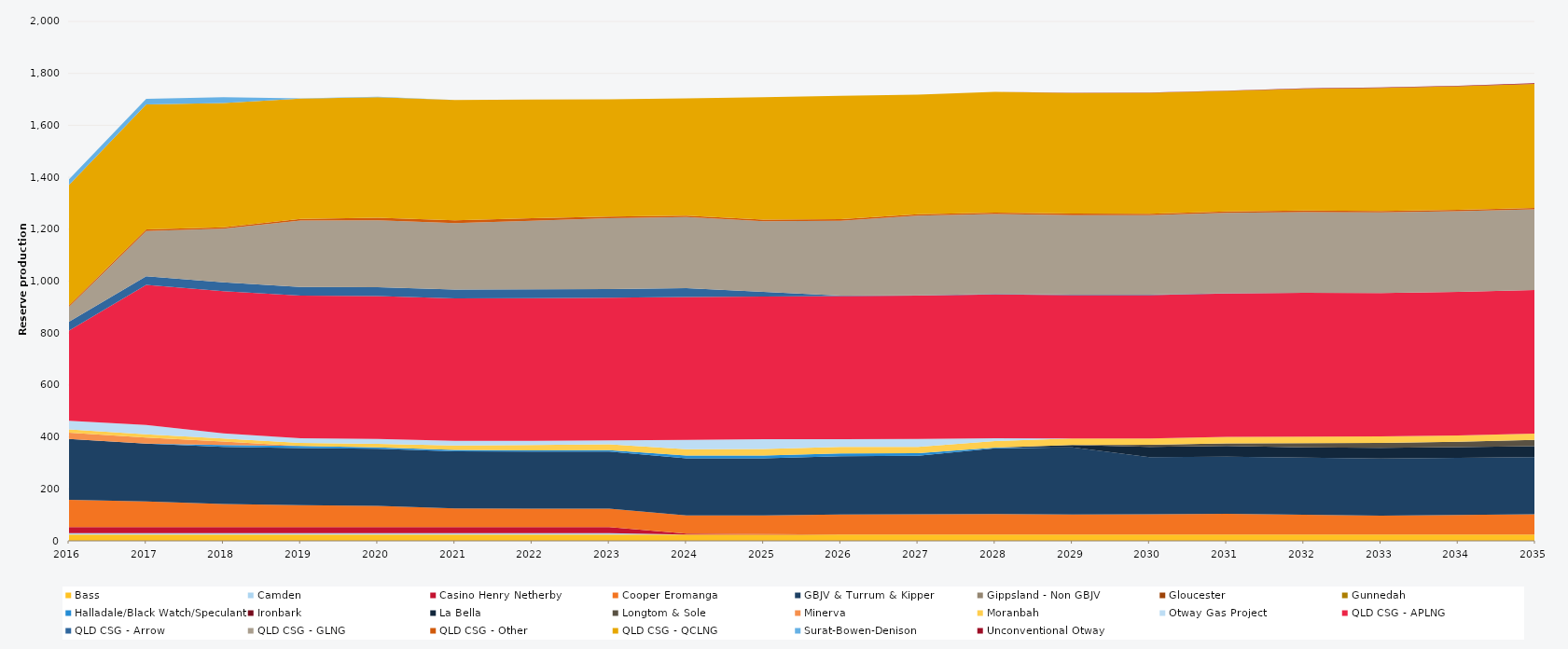
| Category | Bass | Camden | Casino Henry Netherby | Cooper Eromanga | GBJV & Turrum & Kipper | Gippsland - Non GBJV | Gloucester | Gunnedah | Halladale/Black Watch/Speculant | Ironbark | La Bella | Longtom & Sole | Minerva | Moranbah | Otway Gas Project | QLD CSG - APLNG | QLD CSG - Arrow | QLD CSG - GLNG | QLD CSG - Other | QLD CSG - QCLNG | Surat-Bowen-Denison | Unconventional Otway |
|---|---|---|---|---|---|---|---|---|---|---|---|---|---|---|---|---|---|---|---|---|---|---|
| 2016 | 24.522 | 5 | 23.12 | 105 | 235.041 | 0 | 0 | 0 | 0 | 0 | 0 | 0 | 23.79 | 12.82 | 32.597 | 347.544 | 34.038 | 57.36 | 5.856 | 463.602 | 21.957 | 0 |
| 2017 | 24.455 | 5 | 23.12 | 98.848 | 222.562 | 0 | 0 | 0 | 0 | 0 | 0 | 0 | 23.725 | 12.277 | 36.121 | 539.164 | 33.945 | 174.038 | 5.84 | 481.324 | 21.894 | 0 |
| 2018 | 24.455 | 5 | 23.12 | 89.326 | 220 | 0 | 0 | 0 | 7.35 | 0 | 0 | 0 | 13.235 | 11.828 | 19.164 | 548.138 | 33.945 | 206.03 | 5.84 | 478.815 | 21.888 | 0 |
| 2019 | 24.455 | 5 | 23.12 | 84.435 | 220 | 0 | 0 | 0 | 8.519 | 0 | 0 | 0 | 0 | 11.398 | 18.351 | 548.631 | 33.945 | 255.543 | 5.84 | 463.624 | 1.077 | 0 |
| 2020 | 24.522 | 5 | 23.12 | 82.325 | 220 | 0 | 0 | 0 | 5.202 | 0 | 0 | 0 | 0 | 12.873 | 19.655 | 550.187 | 34.038 | 256.949 | 9.962 | 464.347 | 2 | 0 |
| 2021 | 24.455 | 5 | 23.12 | 72.52 | 220 | 0 | 0 | 0 | 4.854 | 0 | 0 | 0 | 0 | 17.642 | 17.253 | 548.827 | 33.945 | 256.33 | 10.403 | 463.267 | 0 | 0 |
| 2022 | 24.455 | 5 | 23.12 | 71.039 | 220 | 0 | 0 | 0 | 4.811 | 0 | 0 | 0 | 0 | 20.635 | 16.386 | 548.945 | 33.945 | 263.925 | 10.403 | 456.239 | 0 | 0 |
| 2023 | 24.455 | 5 | 23.12 | 71.356 | 220 | 0 | 0 | 0 | 5.269 | 0 | 0 | 0 | 0 | 22.362 | 15.537 | 548.813 | 33.945 | 272.734 | 5.84 | 451.813 | 0 | 0 |
| 2024 | 24.522 | 0 | 3.454 | 69.98 | 220 | 0 | 0 | 0 | 10.95 | 0 | 0 | 0 | 0 | 24.202 | 35.355 | 550.151 | 34.038 | 273.79 | 5.856 | 451.768 | 0 | 0 |
| 2025 | 24.455 | 0 | 1.846 | 71.484 | 220 | 0 | 0 | 0 | 10.95 | 0 | 0 | 0 | 0 | 24.797 | 38 | 549.074 | 18.166 | 272.097 | 5.84 | 471.452 | 0 | 0 |
| 2026 | 24.455 | 0 | 0 | 77.14 | 224.306 | 0 | 0 | 0 | 10.95 | 0 | 0 | 0 | 0 | 24.82 | 29.883 | 550.982 | 1.6 | 288.607 | 5.84 | 474.665 | 0 | 0 |
| 2027 | 24.455 | 0 | 0 | 77.527 | 225.285 | 0 | 0 | 0 | 9.895 | 0 | 0 | 0 | 0 | 24.82 | 30.182 | 551.742 | 1.6 | 306.707 | 5.84 | 460.333 | 0 | 0 |
| 2028 | 24.522 | 0 | 0 | 78.302 | 253.259 | 0 | 0 | 0 | 3.25 | 0 | 0 | 0 | 0 | 24.888 | 11.122 | 553.502 | 1.6 | 307.756 | 5.856 | 464.858 | 0 | 0 |
| 2029 | 24.455 | 0 | 0 | 77 | 258.654 | 0 | 0 | 0 | 0 | 0 | 8.874 | 0 | 0 | 24.82 | 0 | 552.226 | 1.6 | 306.707 | 5.84 | 464.338 | 0 | 0.394 |
| 2030 | 24.455 | 0 | 0 | 78.19 | 220 | 0 | 0 | 0 | 0 | 0 | 39.229 | 7.74 | 0 | 24.82 | 0 | 552.07 | 1.6 | 305.834 | 5.84 | 465.117 | 0 | 1.355 |
| 2031 | 24.455 | 0 | 0 | 79.894 | 220 | 0 | 0 | 0 | 0 | 0 | 41.19 | 10.074 | 0 | 24.82 | 0 | 552.236 | 0.395 | 309.944 | 5.84 | 463.39 | 0.01 | 1.225 |
| 2032 | 24.522 | 0 | 0 | 75.853 | 220 | 0 | 0 | 0 | 0 | 0 | 39.238 | 16.732 | 0 | 24.888 | 0 | 553.758 | 0.205 | 310.873 | 5.856 | 468.252 | 0 | 2.217 |
| 2033 | 24.455 | 0 | 0 | 72.807 | 220 | 0 | 0 | 0 | 0 | 0 | 40.547 | 19.136 | 0 | 24.82 | 0 | 552.245 | 0.19 | 310.199 | 5.84 | 473.96 | 0 | 1.57 |
| 2034 | 24.455 | 0 | 0 | 75.152 | 220 | 0 | 0 | 0 | 0 | 0 | 41.366 | 20.354 | 0 | 24.82 | 0 | 552.245 | 0.261 | 310.24 | 5.84 | 476.114 | 0 | 1.483 |
| 2035 | 24.455 | 0 | 0 | 77.951 | 220 | 0 | 0 | 0 | 0 | 0 | 41.821 | 24.374 | 0 | 24.82 | 0 | 552.245 | 0.36 | 310.36 | 5.84 | 477.274 | 0 | 2.755 |